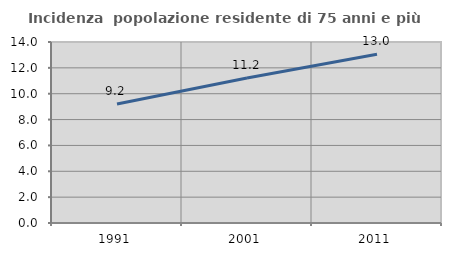
| Category | Incidenza  popolazione residente di 75 anni e più |
|---|---|
| 1991.0 | 9.206 |
| 2001.0 | 11.217 |
| 2011.0 | 13.045 |